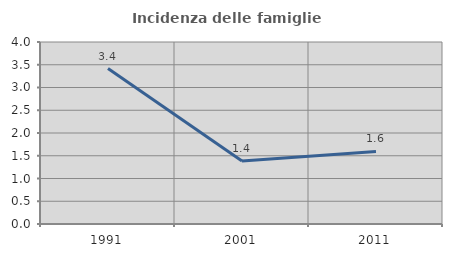
| Category | Incidenza delle famiglie numerose |
|---|---|
| 1991.0 | 3.417 |
| 2001.0 | 1.387 |
| 2011.0 | 1.596 |